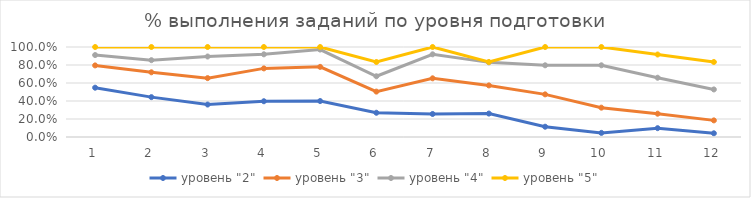
| Category | уровень "2" | уровень "3" | уровень "4" | уровень "5" |
|---|---|---|---|---|
| 0 | 0.548 | 0.795 | 0.911 | 1 |
| 1 | 0.443 | 0.719 | 0.854 | 1 |
| 2 | 0.361 | 0.654 | 0.894 | 1 |
| 3 | 0.397 | 0.762 | 0.919 | 1 |
| 4 | 0.4 | 0.779 | 0.972 | 1 |
| 5 | 0.269 | 0.504 | 0.675 | 0.833 |
| 6 | 0.256 | 0.652 | 0.919 | 1 |
| 7 | 0.26 | 0.573 | 0.829 | 0.833 |
| 8 | 0.114 | 0.474 | 0.797 | 1 |
| 9 | 0.046 | 0.326 | 0.797 | 1 |
| 10 | 0.098 | 0.259 | 0.659 | 0.917 |
| 11 | 0.041 | 0.185 | 0.528 | 0.833 |